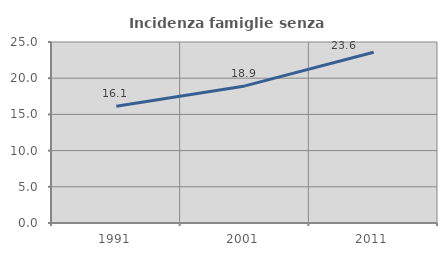
| Category | Incidenza famiglie senza nuclei |
|---|---|
| 1991.0 | 16.112 |
| 2001.0 | 18.935 |
| 2011.0 | 23.59 |